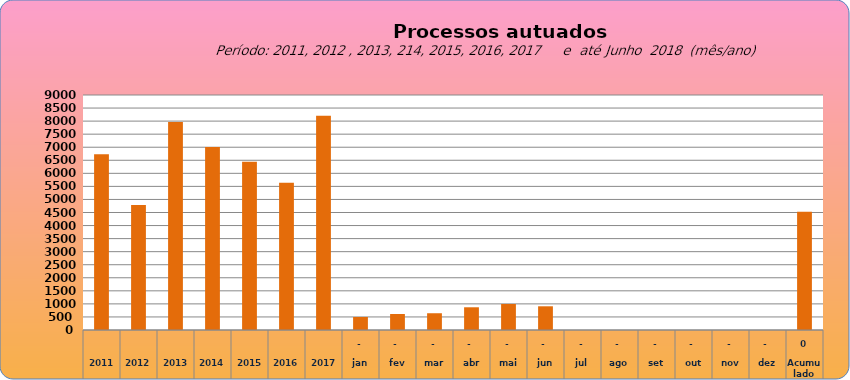
| Category | 6735 |
|---|---|
| 2011 | 6735 |
| 2012 | 4786 |
| 2013 | 7967 |
| 2014 | 7011 |
| 2015 | 6446 |
| 2016 | 5644 |
| 2017 | 8210 |
| jan | 498 |
| fev | 612 |
| mar | 642 |
| abr | 870 |
| mai | 995 |
| jun | 908 |
| jul | 0 |
| ago | 0 |
| set | 0 |
| out | 0 |
| nov | 0 |
| dez | 0 |
| Acumulado
 | 4525 |